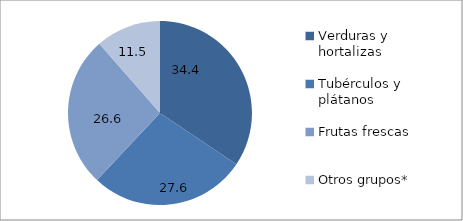
| Category | Abastecimiento mensual Bogotá |
|---|---|
| Verduras y hortalizas  | 34.403 |
| Tubérculos y plátanos  | 27.589 |
| Frutas frescas  | 26.553 |
| Otros grupos* | 11.455 |